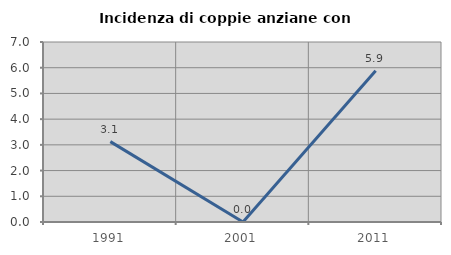
| Category | Incidenza di coppie anziane con figli |
|---|---|
| 1991.0 | 3.125 |
| 2001.0 | 0 |
| 2011.0 | 5.882 |